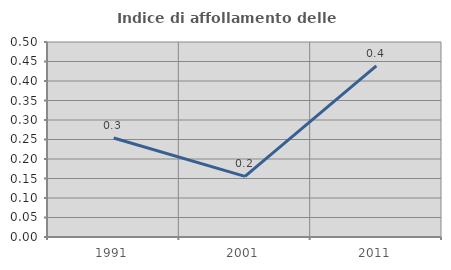
| Category | Indice di affollamento delle abitazioni  |
|---|---|
| 1991.0 | 0.254 |
| 2001.0 | 0.155 |
| 2011.0 | 0.439 |